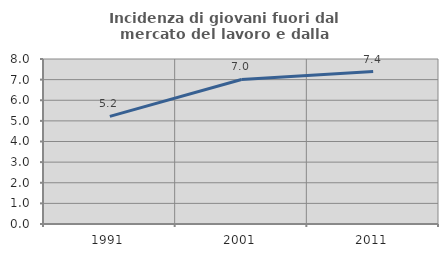
| Category | Incidenza di giovani fuori dal mercato del lavoro e dalla formazione  |
|---|---|
| 1991.0 | 5.218 |
| 2001.0 | 7.009 |
| 2011.0 | 7.392 |